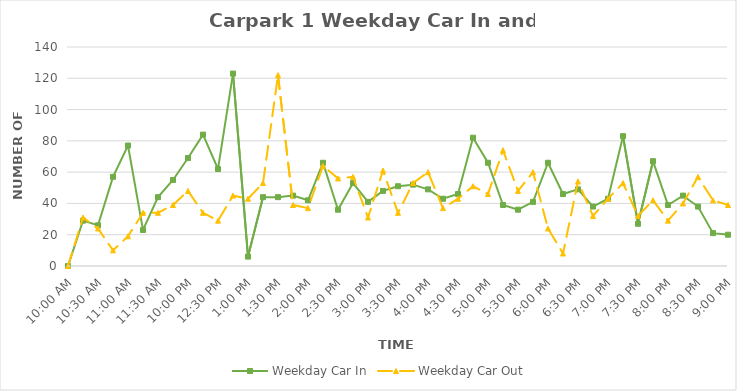
| Category | Weekday Car In | Weekday Car Out |
|---|---|---|
| 0.4166666666666667 | 0 | 0 |
| 0.4270833333333333 | 29 | 31 |
| 0.4375 | 26 | 24 |
| 0.4479166666666667 | 57 | 10 |
| 0.4583333333333333 | 77 | 19 |
| 0.46875 | 23 | 34 |
| 0.4791666666666667 | 44 | 34 |
| 0.4895833333333333 | 55 | 39 |
| 0.5 | 69 | 48 |
| 0.5104166666666666 | 84 | 34 |
| 0.5208333333333334 | 62 | 29 |
| 0.53125 | 123 | 45 |
| 0.5416666666666666 | 6 | 43 |
| 0.5520833333333334 | 44 | 53 |
| 0.5625 | 44 | 122 |
| 0.5729166666666666 | 45 | 39 |
| 0.5833333333333334 | 42 | 37 |
| 0.59375 | 66 | 64 |
| 0.604166666666667 | 36 | 56 |
| 0.614583333333334 | 53 | 57 |
| 0.625 | 41 | 31 |
| 0.635416666666667 | 48 | 61 |
| 0.645833333333334 | 51 | 34 |
| 0.656250000000001 | 52 | 53 |
| 0.666666666666667 | 49 | 60 |
| 0.677083333333334 | 43 | 37 |
| 0.687500000000001 | 46 | 43 |
| 0.697916666666668 | 82 | 51 |
| 0.708333333333335 | 66 | 46 |
| 0.718750000000002 | 39 | 74 |
| 0.729166666666669 | 36 | 48 |
| 0.739583333333336 | 41 | 60 |
| 0.75 | 66 | 24 |
| 0.7604166666666666 | 46 | 8 |
| 0.7708333333333334 | 49 | 54 |
| 0.78125 | 38 | 32 |
| 0.7916666666666666 | 43 | 43 |
| 0.8020833333333334 | 83 | 53 |
| 0.8125 | 27 | 32 |
| 0.8229166666666666 | 67 | 42 |
| 0.8333333333333334 | 39 | 29 |
| 0.84375 | 45 | 40 |
| 0.8541666666666666 | 38 | 57 |
| 0.8645833333333334 | 21 | 42 |
| 0.875 | 20 | 39 |